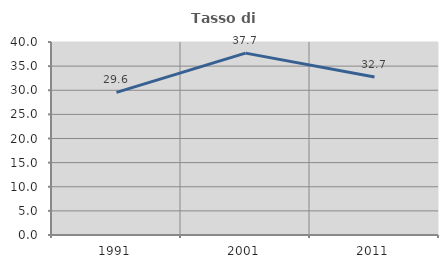
| Category | Tasso di occupazione   |
|---|---|
| 1991.0 | 29.56 |
| 2001.0 | 37.692 |
| 2011.0 | 32.727 |